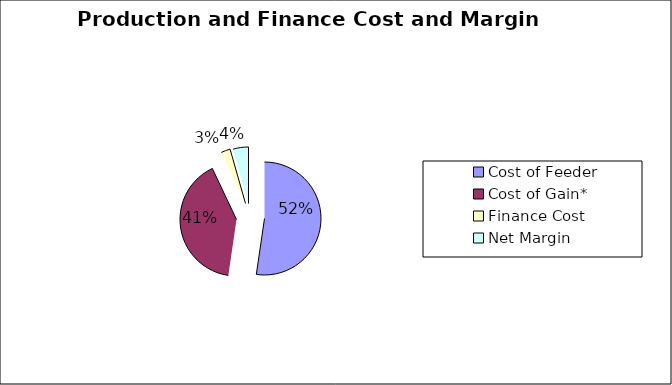
| Category | $/Head |
|---|---|
| Cost of Feeder | 837.004 |
| Cost of Gain*  | 650.368 |
| Finance Cost | 42.222 |
| Net Margin | 70.467 |